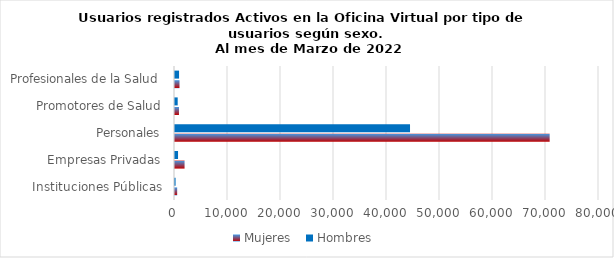
| Category | Mujeres | Hombres |
|---|---|---|
| Instituciones Públicas | 409 | 109 |
| Empresas Privadas | 1804 | 574 |
| Personales | 70691 | 44344 |
| Promotores de Salud | 748 | 507 |
| Profesionales de la Salud | 848 | 766 |